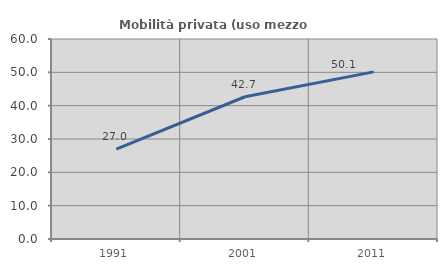
| Category | Mobilità privata (uso mezzo privato) |
|---|---|
| 1991.0 | 26.959 |
| 2001.0 | 42.674 |
| 2011.0 | 50.141 |